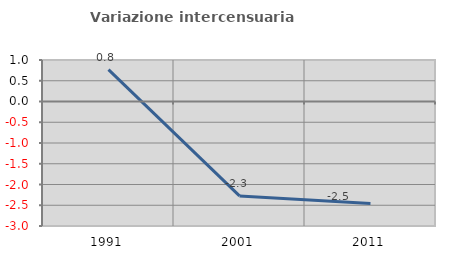
| Category | Variazione intercensuaria annua |
|---|---|
| 1991.0 | 0.769 |
| 2001.0 | -2.275 |
| 2011.0 | -2.459 |